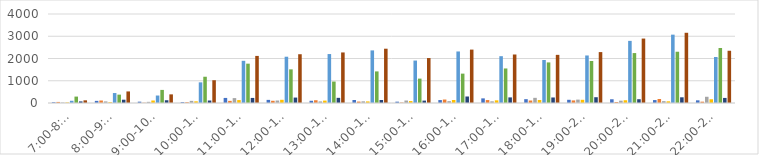
| Category | Series 0 | Series 1 | Series 2 | Series 3 | Series 4 | Series 5 | Series 6 | Series 7 |
|---|---|---|---|---|---|---|---|---|
| 7:00-8:00 | 36 | 48 | 20 | 24 | 100 | 288 | 72 | 120 |
| 8:00-9:00 | 96 | 112 | 72 | 36 | 448 | 376 | 148 | 520 |
| 9:00-10:00 | 60 | 12 | 52 | 112 | 336 | 588 | 124 | 388 |
| 10:00-11:00 | 40 | 36 | 96 | 76 | 928 | 1180 | 112 | 1024 |
| 11:00-12:00 | 228 | 96 | 220 | 132 | 1896 | 1768 | 228 | 2116 |
| 12:00-13:00 | 140 | 100 | 112 | 144 | 2080 | 1512 | 244 | 2192 |
| 13:00-14:00 | 100 | 124 | 72 | 108 | 2200 | 964 | 232 | 2272 |
| 14:00-15:00 | 136 | 64 | 76 | 72 | 2364 | 1420 | 136 | 2440 |
| 15:00-16:00 | 60 | 20 | 112 | 88 | 1908 | 1096 | 108 | 2020 |
| 16:00-17:00 | 132 | 156 | 84 | 136 | 2316 | 1320 | 292 | 2400 |
| 17:00-18:00 | 208 | 132 | 76 | 120 | 2104 | 1552 | 252 | 2180 |
| 18:00-19:00 | 172 | 112 | 232 | 136 | 1932 | 1824 | 248 | 2164 |
| 19:00-20:00 | 144 | 116 | 152 | 144 | 2136 | 1888 | 260 | 2288 |
| 20:00-21:00 | 168 | 46 | 104 | 124 | 2792 | 2244 | 170 | 2896 |
| 21:00-22:00 | 132 | 180 | 84 | 76 | 3072 | 2304 | 256 | 3156 |
| 22:00-23:00 | 120 | 60 | 280 | 168 | 2068 | 2472 | 228 | 2348 |